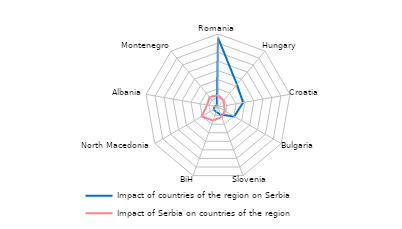
| Category | Impact of countries of the region on Serbia | Impact of Serbia on countries of the region |
|---|---|---|
| Romania | 0.38 | 0.064 |
| Hungary | 0.161 | 0.047 |
| Croatia | 0.139 | 0.034 |
| Bulgaria | 0.103 | 0.042 |
| Slovenia | 0.045 | 0.059 |
| BiH | 0.029 | 0.079 |
| North Macedonia | 0.027 | 0.103 |
| Albania | 0.019 | 0.061 |
| Montenegro | 0.009 | 0.072 |